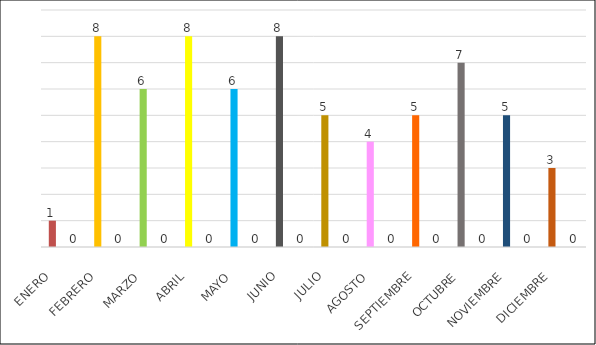
| Category | Series 1 |
|---|---|
| ENERO | 1 |
|  | 0 |
| FEBRERO | 8 |
|  | 0 |
| MARZO | 6 |
|  | 0 |
| ABRIL | 8 |
|  | 0 |
| MAYO | 6 |
|  | 0 |
| JUNIO | 8 |
|  | 0 |
| JULIO | 5 |
|  | 0 |
| AGOSTO | 4 |
|  | 0 |
| SEPTIEMBRE | 5 |
|  | 0 |
| OCTUBRE | 7 |
|  | 0 |
| NOVIEMBRE | 5 |
|  | 0 |
| DICIEMBRE | 3 |